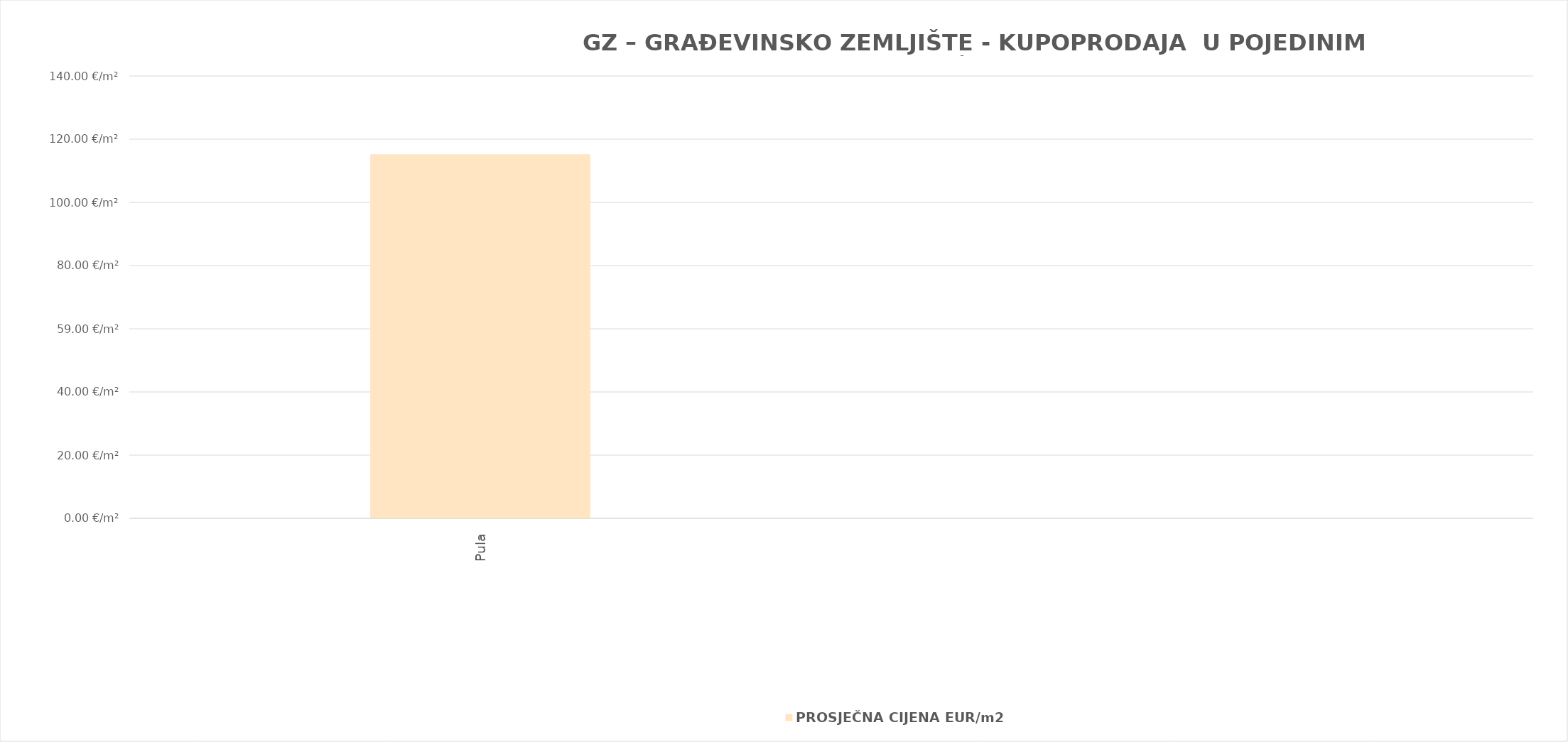
| Category | PROSJEČNA CIJENA EUR/m2 |
|---|---|
| Pula | 1900-04-24 05:19:53 |